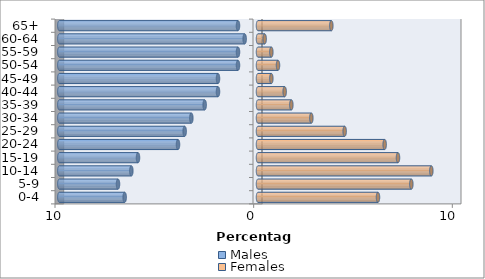
| Category | Males | Females |
|---|---|---|
| 0-4 | -6.711 | 6.04 |
| 5-9 | -7.047 | 7.718 |
| 10-14 | -6.376 | 8.725 |
| 15-19 | -6.04 | 7.047 |
| 20-24 | -4.027 | 6.376 |
| 25-29 | -3.691 | 4.362 |
| 30-34 | -3.356 | 2.685 |
| 35-39 | -2.685 | 1.678 |
| 40-44 | -2.013 | 1.342 |
| 45-49 | -2.013 | 0.671 |
| 50-54 | -1.007 | 1.007 |
| 55-59 | -1.007 | 0.671 |
| 60-64 | -0.671 | 0.336 |
| 65+ | -1.007 | 3.691 |